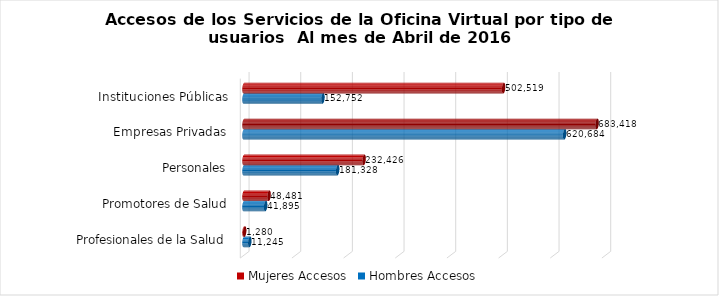
| Category | Mujeres | Hombres |
|---|---|---|
| Instituciones Públicas | 502519 | 152752 |
| Empresas Privadas | 683418 | 620684 |
| Personales | 232426 | 181328 |
| Promotores de Salud | 48481 | 41895 |
| Profesionales de la Salud | 1280 | 11245 |